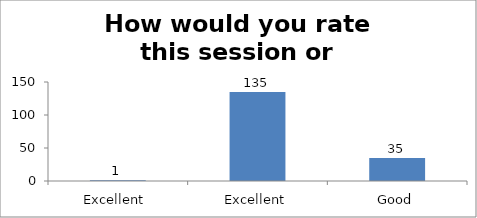
| Category | How would you rate this session or workshop? |
|---|---|
| Excellent  | 1 |
| Excellent | 135 |
| Good | 35 |